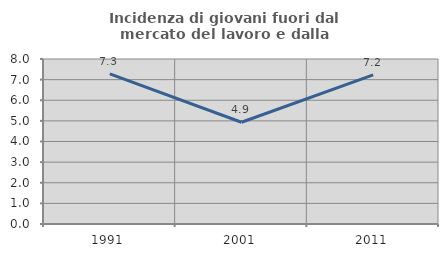
| Category | Incidenza di giovani fuori dal mercato del lavoro e dalla formazione  |
|---|---|
| 1991.0 | 7.279 |
| 2001.0 | 4.933 |
| 2011.0 | 7.231 |